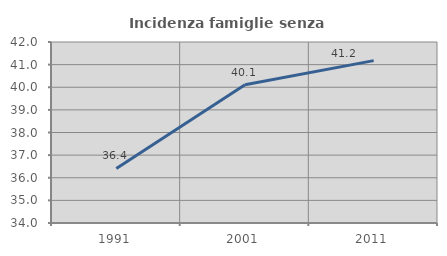
| Category | Incidenza famiglie senza nuclei |
|---|---|
| 1991.0 | 36.413 |
| 2001.0 | 40.113 |
| 2011.0 | 41.176 |